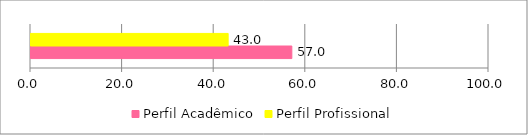
| Category | Perfil Acadêmico | Perfil Profissional |
|---|---|---|
| 0 | 56.952 | 43.048 |